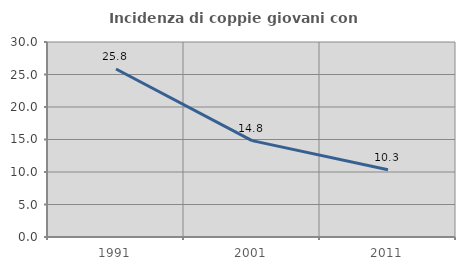
| Category | Incidenza di coppie giovani con figli |
|---|---|
| 1991.0 | 25.845 |
| 2001.0 | 14.823 |
| 2011.0 | 10.35 |